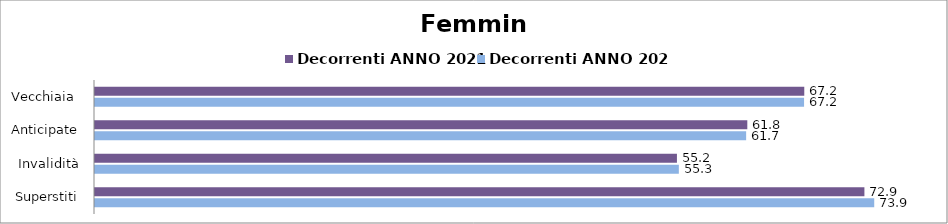
| Category | Decorrenti ANNO 2021 | Decorrenti ANNO 2022 |
|---|---|---|
| Vecchiaia  | 67.23 | 67.21 |
| Anticipate | 61.83 | 61.72 |
| Invalidità | 55.16 | 55.34 |
| Superstiti | 72.93 | 73.86 |